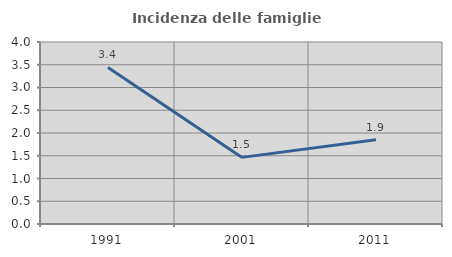
| Category | Incidenza delle famiglie numerose |
|---|---|
| 1991.0 | 3.441 |
| 2001.0 | 1.464 |
| 2011.0 | 1.853 |